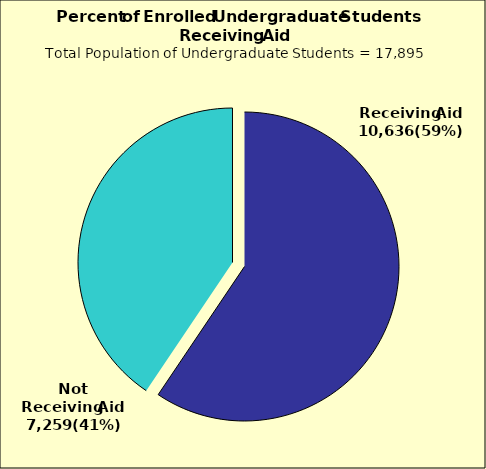
| Category | Series 0 |
|---|---|
| 0 | 10636 |
| 1 | 7259 |